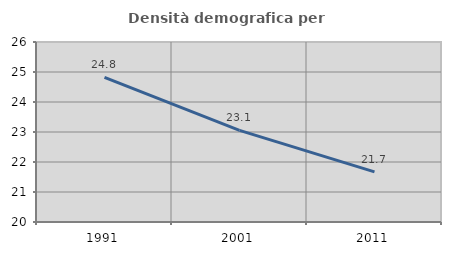
| Category | Densità demografica |
|---|---|
| 1991.0 | 24.821 |
| 2001.0 | 23.054 |
| 2011.0 | 21.671 |